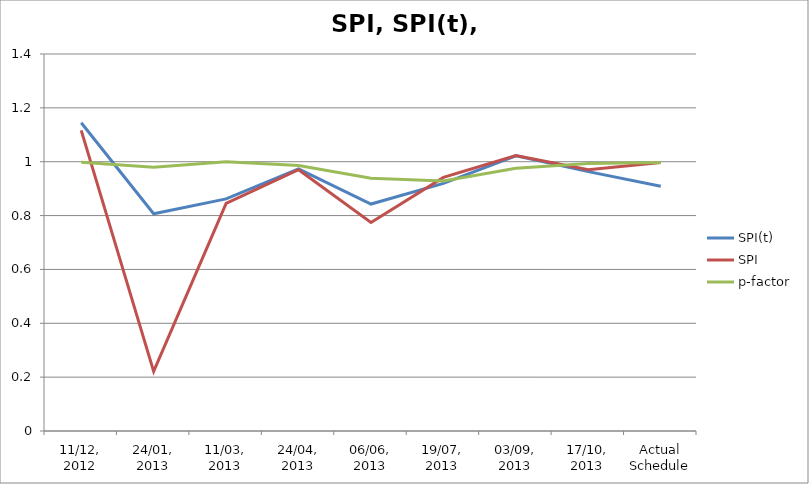
| Category | SPI(t) | SPI | p-factor |
|---|---|---|---|
| 11/12, 2012 | 1.145 | 1.116 | 0.998 |
| 24/01, 2013 | 0.807 | 0.222 | 0.979 |
| 11/03, 2013 | 0.862 | 0.845 | 1 |
| 24/04, 2013 | 0.974 | 0.97 | 0.986 |
| 06/06, 2013 | 0.843 | 0.775 | 0.938 |
| 19/07, 2013 | 0.92 | 0.942 | 0.929 |
| 03/09, 2013 | 1.022 | 1.023 | 0.976 |
| 17/10, 2013 | 0.963 | 0.971 | 0.993 |
| Actual Schedule | 0.909 | 0.997 | 0.997 |